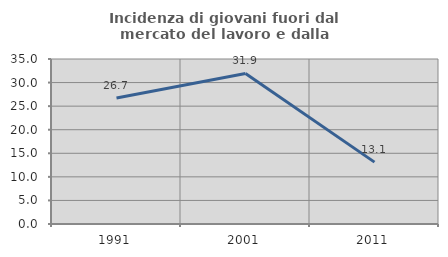
| Category | Incidenza di giovani fuori dal mercato del lavoro e dalla formazione  |
|---|---|
| 1991.0 | 26.724 |
| 2001.0 | 31.939 |
| 2011.0 | 13.122 |